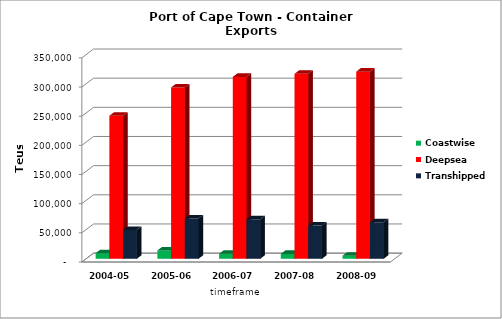
| Category | Coastwise | Deepsea | Transhipped |
|---|---|---|---|
| 2004-05 | 9596 | 245238 | 49417 |
| 2005-06 | 14315 | 293733 | 69028 |
| 2006-07 | 8544 | 311874 | 67489 |
| 2007-08 | 8376 | 317174 | 56885 |
| 2008-09 | 5272 | 320889 | 62573 |